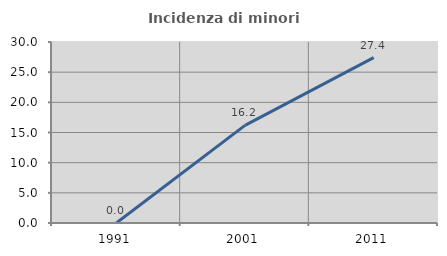
| Category | Incidenza di minori stranieri |
|---|---|
| 1991.0 | 0 |
| 2001.0 | 16.176 |
| 2011.0 | 27.404 |